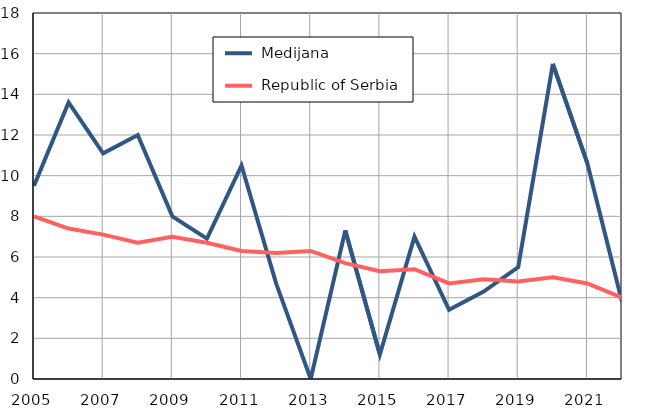
| Category |  Medijana |  Republic of Serbia |
|---|---|---|
| 2005.0 | 9.5 | 8 |
| 2006.0 | 13.6 | 7.4 |
| 2007.0 | 11.1 | 7.1 |
| 2008.0 | 12 | 6.7 |
| 2009.0 | 8 | 7 |
| 2010.0 | 6.9 | 6.7 |
| 2011.0 | 10.5 | 6.3 |
| 2012.0 | 4.7 | 6.2 |
| 2013.0 | 0 | 6.3 |
| 2014.0 | 7.3 | 5.7 |
| 2015.0 | 1.2 | 5.3 |
| 2016.0 | 7 | 5.4 |
| 2017.0 | 3.4 | 4.7 |
| 2018.0 | 4.3 | 4.9 |
| 2019.0 | 5.5 | 4.8 |
| 2020.0 | 15.5 | 5 |
| 2021.0 | 10.6 | 4.7 |
| 2022.0 | 3.8 | 4 |